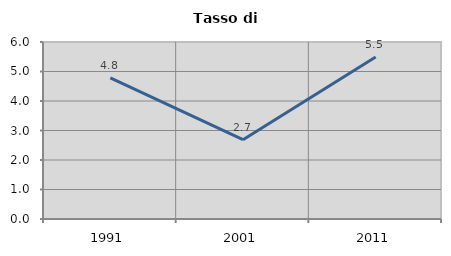
| Category | Tasso di disoccupazione   |
|---|---|
| 1991.0 | 4.787 |
| 2001.0 | 2.69 |
| 2011.0 | 5.495 |